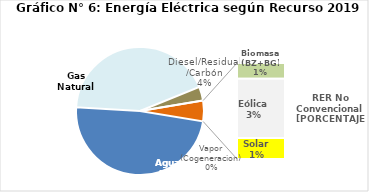
| Category | Series 0 |
|---|---|
| Agua | 2225.359 |
| Gas Natural | 1977.933 |
| Diesel/Residual/Carbón | 163.192 |
| Vapor (Cogeneracion) | 0.361 |
| Biomasa (BZ+BG) | 39.286 |
| Eólica | 148.609 |
| Solar | 52.893 |